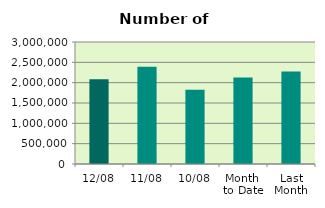
| Category | Series 0 |
|---|---|
| 12/08 | 2081224 |
| 11/08 | 2392012 |
| 10/08 | 1823720 |
| Month 
to Date | 2124591.5 |
| Last
Month | 2275631.565 |